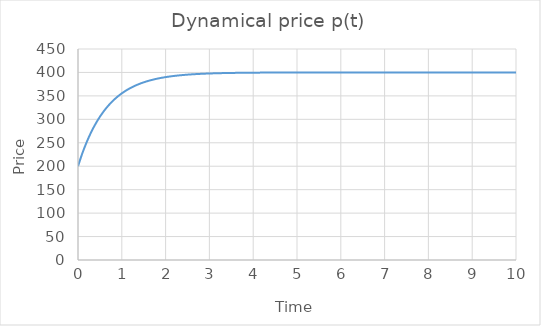
| Category | Series 0 |
|---|---|
| 0.0 | 200 |
| 0.1 | 227.858 |
| 0.2 | 251.836 |
| 0.30000000000000004 | 272.474 |
| 0.4 | 290.238 |
| 0.5 | 305.527 |
| 0.6 | 318.686 |
| 0.7 | 330.012 |
| 0.7999999999999999 | 339.761 |
| 0.8999999999999999 | 348.152 |
| 0.9999999999999999 | 355.374 |
| 1.0999999999999999 | 361.59 |
| 1.2 | 366.94 |
| 1.3 | 371.545 |
| 1.4000000000000001 | 375.509 |
| 1.5000000000000002 | 378.92 |
| 1.6000000000000003 | 381.856 |
| 1.7000000000000004 | 384.384 |
| 1.8000000000000005 | 386.559 |
| 1.9000000000000006 | 388.431 |
| 2.0000000000000004 | 390.043 |
| 2.1000000000000005 | 391.43 |
| 2.2000000000000006 | 392.623 |
| 2.3000000000000007 | 393.651 |
| 2.400000000000001 | 394.535 |
| 2.500000000000001 | 395.296 |
| 2.600000000000001 | 395.952 |
| 2.700000000000001 | 396.516 |
| 2.800000000000001 | 397.001 |
| 2.9000000000000012 | 397.419 |
| 3.0000000000000013 | 397.778 |
| 3.1000000000000014 | 398.088 |
| 3.2000000000000015 | 398.354 |
| 3.3000000000000016 | 398.583 |
| 3.4000000000000017 | 398.781 |
| 3.5000000000000018 | 398.95 |
| 3.600000000000002 | 399.097 |
| 3.700000000000002 | 399.223 |
| 3.800000000000002 | 399.331 |
| 3.900000000000002 | 399.424 |
| 4.000000000000002 | 399.504 |
| 4.100000000000001 | 399.573 |
| 4.200000000000001 | 399.633 |
| 4.300000000000001 | 399.684 |
| 4.4 | 399.728 |
| 4.5 | 399.766 |
| 4.6 | 399.798 |
| 4.699999999999999 | 399.827 |
| 4.799999999999999 | 399.851 |
| 4.899999999999999 | 399.871 |
| 4.999999999999998 | 399.889 |
| 5.099999999999998 | 399.905 |
| 5.1999999999999975 | 399.918 |
| 5.299999999999997 | 399.929 |
| 5.399999999999997 | 399.939 |
| 5.4999999999999964 | 399.948 |
| 5.599999999999996 | 399.955 |
| 5.699999999999996 | 399.961 |
| 5.799999999999995 | 399.967 |
| 5.899999999999995 | 399.971 |
| 5.999999999999995 | 399.975 |
| 6.099999999999994 | 399.979 |
| 6.199999999999994 | 399.982 |
| 6.299999999999994 | 399.984 |
| 6.399999999999993 | 399.986 |
| 6.499999999999993 | 399.988 |
| 6.5999999999999925 | 399.99 |
| 6.699999999999992 | 399.991 |
| 6.799999999999992 | 399.993 |
| 6.8999999999999915 | 399.994 |
| 6.999999999999991 | 399.994 |
| 7.099999999999991 | 399.995 |
| 7.19999999999999 | 399.996 |
| 7.29999999999999 | 399.996 |
| 7.39999999999999 | 399.997 |
| 7.499999999999989 | 399.997 |
| 7.599999999999989 | 399.998 |
| 7.699999999999989 | 399.998 |
| 7.799999999999988 | 399.998 |
| 7.899999999999988 | 399.999 |
| 7.999999999999988 | 399.999 |
| 8.099999999999987 | 399.999 |
| 8.199999999999987 | 399.999 |
| 8.299999999999986 | 399.999 |
| 8.399999999999986 | 399.999 |
| 8.499999999999986 | 399.999 |
| 8.599999999999985 | 400 |
| 8.699999999999985 | 400 |
| 8.799999999999985 | 400 |
| 8.899999999999984 | 400 |
| 8.999999999999984 | 400 |
| 9.099999999999984 | 400 |
| 9.199999999999983 | 400 |
| 9.299999999999983 | 400 |
| 9.399999999999983 | 400 |
| 9.499999999999982 | 400 |
| 9.599999999999982 | 400 |
| 9.699999999999982 | 400 |
| 9.799999999999981 | 400 |
| 9.89999999999998 | 400 |
| 9.99999999999998 | 400 |